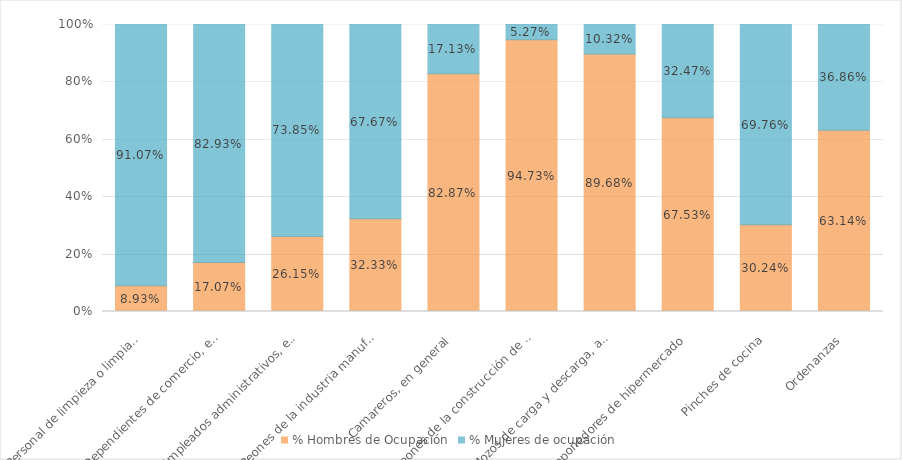
| Category | % Hombres de Ocupación | % Mujeres de ocupación |
|---|---|---|
| Personal de limpieza o limpiadores en general | 0.089 | 0.911 |
| Dependientes de comercio, en general | 0.171 | 0.829 |
| Empleados administrativos, en general | 0.262 | 0.738 |
| Peones de la industria manufacturera, en general | 0.323 | 0.677 |
| Camareros, en general | 0.829 | 0.171 |
| Peones de la construcción de edificios | 0.947 | 0.053 |
| Mozos de carga y descarga, almacén y/o mercado de abastos | 0.897 | 0.103 |
| Reponedores de hipermercado | 0.675 | 0.325 |
| Pinches de cocina | 0.302 | 0.698 |
| Ordenanzas | 0.631 | 0.369 |